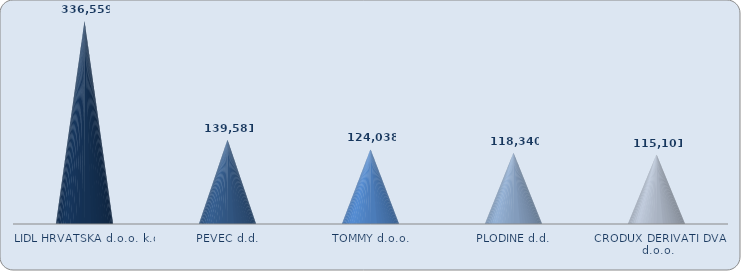
| Category | Series 0 |
|---|---|
| LIDL HRVATSKA d.o.o. k.d. | 336559.344 |
| PEVEC d.d. | 139581.416 |
| TOMMY d.o.o. | 124038.026 |
| PLODINE d.d. | 118340.165 |
| CRODUX DERIVATI DVA d.o.o. | 115100.685 |